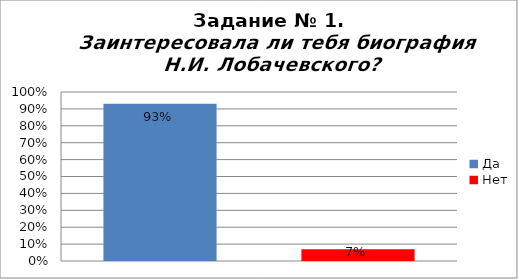
| Category | Заинтересовала ли тебя биография Н.И. Лобачевского? |
|---|---|
| Да | 0.93 |
| Нет | 0.07 |